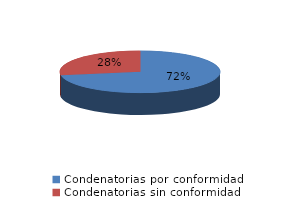
| Category | Series 0 |
|---|---|
| 0 | 1018 |
| 1 | 388 |